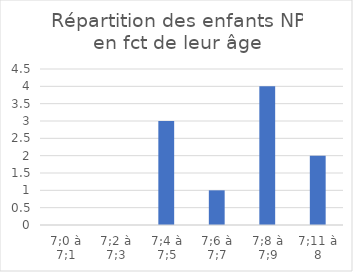
| Category | Series 0 |
|---|---|
| 7;0 à 7;1 | 0 |
| 7;2 à 7;3 | 0 |
| 7;4 à 7;5 | 3 |
| 7;6 à 7;7 | 1 |
| 7;8 à 7;9 | 4 |
| 7;11 à 8 | 2 |